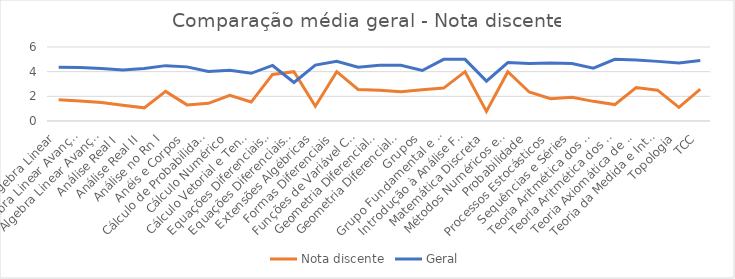
| Category | Nota discente | Geral |
|---|---|---|
| Álgebra Linear | 1.72 | 4.357 |
| Álgebra Linear Avançada I | 1.618 | 4.33 |
| Álgebra Linear Avançada II | 1.5 | 4.262 |
| Análise Real I | 1.271 | 4.13 |
| Análise Real II | 1.067 | 4.262 |
| Análise no Rn I | 2.4 | 4.489 |
| Anéis e Corpos | 1.308 | 4.389 |
| Cálculo de Probabilidade | 1.435 | 4.024 |
| Cálculo Numérico | 2.087 | 4.111 |
| Cálculo Vetorial e Tensorial | 1.536 | 3.868 |
| Equações Diferenciais Ordinárias | 3.778 | 4.503 |
| Equações Diferenciais Parciais | 4 | 3.12 |
| Extensões Algébricas | 1.2 | 4.533 |
| Formas Diferenciais | 4 | 4.85 |
| Funções de Variável Complexa | 2.562 | 4.354 |
| Geometria Diferencial I | 2.5 | 4.52 |
| Geometria Diferencial II | 2.375 | 4.525 |
| Grupos | 2.529 | 4.093 |
| Grupo Fundamental e Espaço de Recobrimento | 2.667 | 5 |
| Introdução à Análise Funcional | 4 | 5 |
| Matemática Discreta | 0.78 | 3.236 |
| Métodos Numéricos em EDO's | 4 | 4.733 |
| Probabilidade | 2.353 | 4.669 |
| Processos Estocásticos | 1.8 | 4.7 |
| Sequências e Séries | 1.933 | 4.655 |
| Teoria Aritmética dos Números | 1.593 | 4.286 |
| Teoria Aritmética dos Números II | 1.333 | 5 |
| Teoria Axiomática de Conjuntos | 2.714 | 4.94 |
| Teoria da Medida e Integração | 2.5 | 4.835 |
| Topologia | 1.111 | 4.71 |
| TCC | 2.587 | 4.901 |